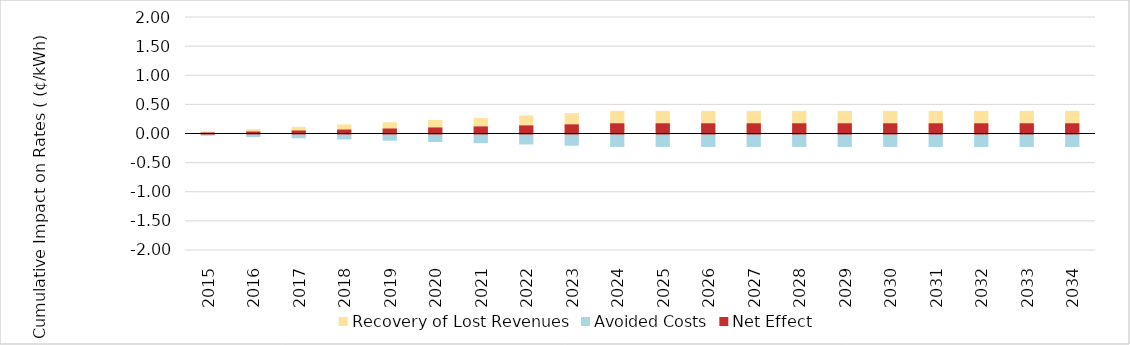
| Category | Recovery of Lost Revenues | Avoided Costs |
|---|---|---|
| 2015.0 | 0.038 | -0.021 |
| 2016.0 | 0.077 | -0.043 |
| 2017.0 | 0.115 | -0.064 |
| 2018.0 | 0.154 | -0.086 |
| 2019.0 | 0.193 | -0.107 |
| 2020.0 | 0.232 | -0.128 |
| 2021.0 | 0.271 | -0.15 |
| 2022.0 | 0.31 | -0.171 |
| 2023.0 | 0.35 | -0.192 |
| 2024.0 | 0.389 | -0.214 |
| 2025.0 | 0.389 | -0.214 |
| 2026.0 | 0.389 | -0.214 |
| 2027.0 | 0.389 | -0.214 |
| 2028.0 | 0.389 | -0.214 |
| 2029.0 | 0.389 | -0.214 |
| 2030.0 | 0.389 | -0.214 |
| 2031.0 | 0.389 | -0.214 |
| 2032.0 | 0.389 | -0.214 |
| 2033.0 | 0.389 | -0.214 |
| 2034.0 | 0.389 | -0.214 |